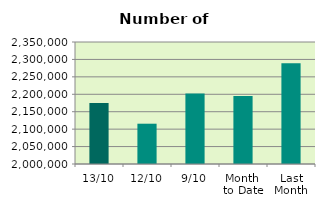
| Category | Series 0 |
|---|---|
| 13/10 | 2175168 |
| 12/10 | 2115598 |
| 9/10 | 2202272 |
| Month 
to Date | 2195107.333 |
| Last
Month | 2288803 |